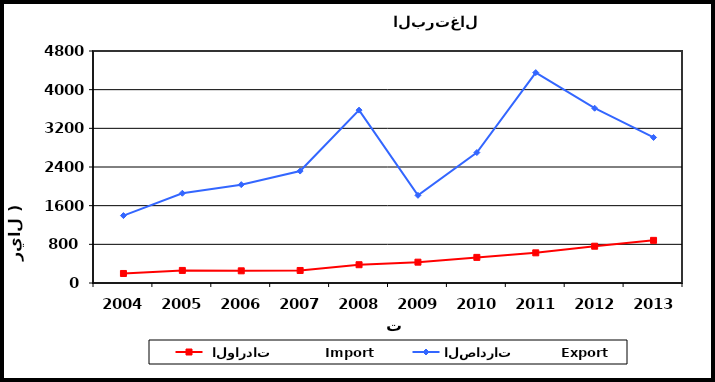
| Category |  الواردات           Import | الصادرات          Export |
|---|---|---|
| 2004.0 | 197 | 1395 |
| 2005.0 | 260 | 1857 |
| 2006.0 | 252 | 2035 |
| 2007.0 | 259 | 2316 |
| 2008.0 | 378 | 3577 |
| 2009.0 | 431 | 1814 |
| 2010.0 | 530 | 2699 |
| 2011.0 | 624 | 4353 |
| 2012.0 | 761 | 3616 |
| 2013.0 | 882 | 3011 |